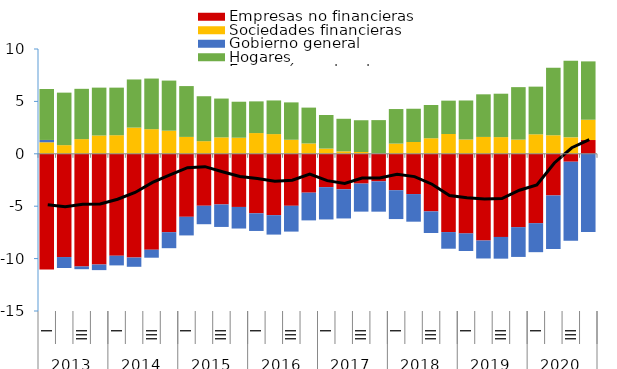
| Category | Empresas no financieras | Sociedades financieras | Gobierno general | Hogares |
|---|---|---|---|---|
| 0 | -11.045 | 1.099 | 0.223 | 4.861 |
| 1 | -9.852 | 0.825 | -1.045 | 5.012 |
| 2 | -10.748 | 1.4 | -0.263 | 4.801 |
| 3 | -10.565 | 1.748 | -0.534 | 4.567 |
| 4 | -9.728 | 1.773 | -0.921 | 4.54 |
| 5 | -9.9 | 2.501 | -0.882 | 4.591 |
| 6 | -9.151 | 2.35 | -0.763 | 4.83 |
| 7 | -7.481 | 2.207 | -1.526 | 4.78 |
| 8 | -6.012 | 1.612 | -1.777 | 4.85 |
| 9 | -4.957 | 1.204 | -1.763 | 4.288 |
| 10 | -4.832 | 1.567 | -2.147 | 3.704 |
| 11 | -5.072 | 1.537 | -2.059 | 3.433 |
| 12 | -5.676 | 1.979 | -1.687 | 3.024 |
| 13 | -5.855 | 1.88 | -1.854 | 3.211 |
| 14 | -4.961 | 1.34 | -2.463 | 3.566 |
| 15 | -3.708 | 0.988 | -2.646 | 3.42 |
| 16 | -3.183 | 0.5 | -3.082 | 3.203 |
| 17 | -3.387 | 0.234 | -2.782 | 3.108 |
| 18 | -2.842 | 0.169 | -2.676 | 3.033 |
| 19 | -2.627 | 0.031 | -2.895 | 3.184 |
| 20 | -3.474 | 0.974 | -2.754 | 3.297 |
| 21 | -3.842 | 1.125 | -2.636 | 3.174 |
| 22 | -5.494 | 1.484 | -2.065 | 3.172 |
| 23 | -7.469 | 1.889 | -1.587 | 3.183 |
| 24 | -7.595 | 1.366 | -1.682 | 3.722 |
| 25 | -8.274 | 1.61 | -1.715 | 4.066 |
| 26 | -7.93 | 1.592 | -2.075 | 4.142 |
| 27 | -7 | 1.354 | -2.841 | 5.007 |
| 28 | -6.621 | 1.86 | -2.766 | 4.549 |
| 29 | -3.975 | 1.768 | -5.111 | 6.442 |
| 30 | -0.754 | 1.57 | -7.553 | 7.313 |
| 31 | 1.314 | 1.937 | -7.462 | 5.568 |